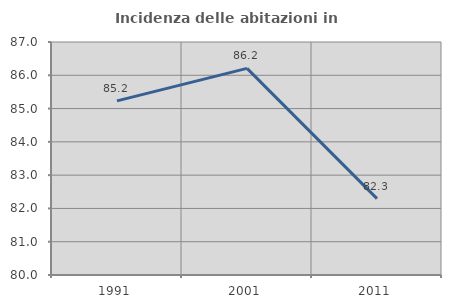
| Category | Incidenza delle abitazioni in proprietà  |
|---|---|
| 1991.0 | 85.231 |
| 2001.0 | 86.207 |
| 2011.0 | 82.295 |